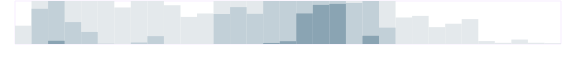
| Category | Финансы | Series 1 | Series 2 | Series 3 |
|---|---|---|---|---|
| 0.333333333333333 | 319 | 0 | 0 | 0 |
| nan | 750 | 614 | 0 | 0 |
| nan | 750 | 750 | 56 | 0 |
| nan | 750 | 382 | 0 | 0 |
| 0.416666666666667 | 750 | 210 | 0 | 0 |
| nan | 750 | 5 | 0 | 0 |
| nan | 637 | 0 | 0 | 0 |
| nan | 750 | 26 | 0 | 0 |
| 0.5 | 750 | 137 | 0 | 0 |
| nan | 676 | 0 | 0 | 0 |
| nan | 472 | 0 | 0 | 0 |
| nan | 532 | 0 | 0 | 0 |
| 0.583333333333333 | 750 | 523 | 0 | 0 |
| nan | 750 | 643 | 0 | 0 |
| nan | 750 | 526 | 0 | 0 |
| nan | 750 | 750 | 18 | 0 |
| 0.666666666666667 | 750 | 750 | 49 | 0 |
| nan | 750 | 750 | 533 | 0 |
| nan | 750 | 750 | 682 | 0 |
| nan | 750 | 750 | 700 | 0 |
| 0.75 | 750 | 715 | 0 | 0 |
| nan | 750 | 750 | 143 | 0 |
| nan | 750 | 285 | 0 | 0 |
| nan | 462 | 0 | 0 | 0 |
| 0.833333333333333 | 490 | 0 | 0 | 0 |
| nan | 294 | 0 | 0 | 0 |
| nan | 353 | 0 | 0 | 0 |
| nan | 434 | 0 | 0 | 0 |
| 0.916666666666667 | 51 | 0 | 0 | 0 |
| nan | 20 | 0 | 0 | 0 |
| nan | 77 | 0 | 0 | 0 |
| nan | 21 | 0 | 0 | 0 |
| 0.9993055555555556 | 13 | 0 | 0 | 0 |